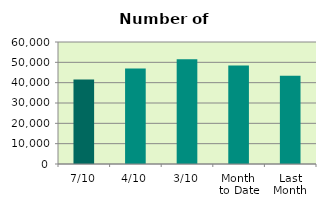
| Category | Series 0 |
|---|---|
| 7/10 | 41496 |
| 4/10 | 46934 |
| 3/10 | 51496 |
| Month 
to Date | 48488 |
| Last
Month | 43452.667 |